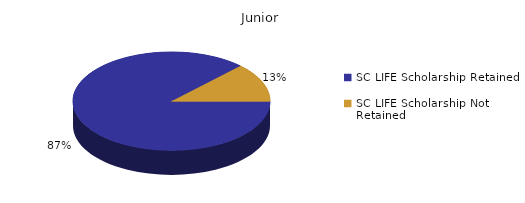
| Category | Junior |
|---|---|
| SC LIFE Scholarship Retained  | 1834 |
| SC LIFE Scholarship Not Retained  | 267 |